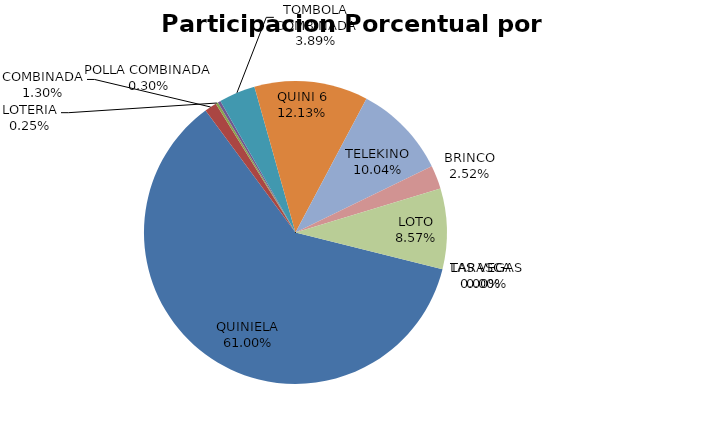
| Category | Series 0 |
|---|---|
| QUINIELA | 1992182 |
| COMBINADA | 42512 |
| LOTERIA | 8253 |
| POLLA COMBINADA | 9852 |
| TOMBOLA COMBINADA | 126965 |
| QUINI 6 | 396275 |
| TELEKINO | 328037 |
| BRINCO | 82161 |
| LOTO | 279902 |
| TARASCA | 0 |
| LAS VEGAS | 0 |